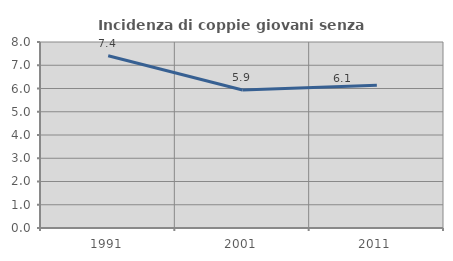
| Category | Incidenza di coppie giovani senza figli |
|---|---|
| 1991.0 | 7.407 |
| 2001.0 | 5.936 |
| 2011.0 | 6.143 |